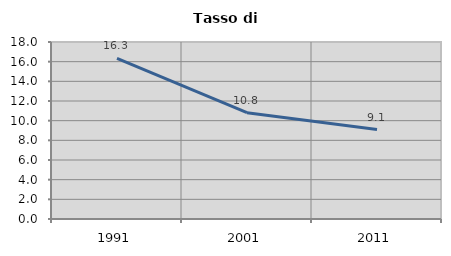
| Category | Tasso di disoccupazione   |
|---|---|
| 1991.0 | 16.327 |
| 2001.0 | 10.811 |
| 2011.0 | 9.091 |